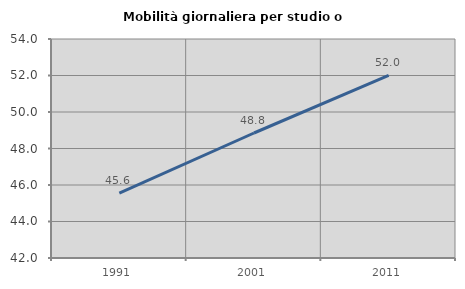
| Category | Mobilità giornaliera per studio o lavoro |
|---|---|
| 1991.0 | 45.555 |
| 2001.0 | 48.849 |
| 2011.0 | 52.005 |